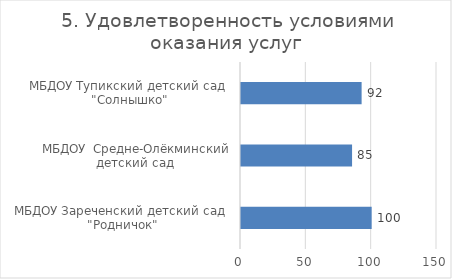
| Category | 5. Удовлетворенность условиями оказания услуг |
|---|---|
| МБДОУ Зареченский детский сад  "Родничок" | 100 |
| МБДОУ  Средне-Олёкминский детский сад  | 85 |
| МБДОУ Тупикский детский сад  "Солнышко" | 92.308 |